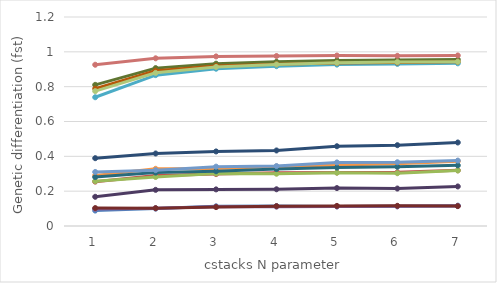
| Category | Series 0 | Series 1 | Series 2 | Series 3 | Series 4 | Series 5 | Series 6 | Series 7 | Series 8 | Series 9 | Series 10 | Series 11 | Series 12 | Series 13 | Series 14 |
|---|---|---|---|---|---|---|---|---|---|---|---|---|---|---|---|
| 0 | 0.089 | 0.255 | 0.258 | 0.098 | 0.739 | 0.29 | 0.389 | 0.103 | 0.81 | 0.168 | 0.281 | 0.789 | 0.31 | 0.926 | 0.774 |
| 1 | 0.1 | 0.29 | 0.281 | 0.101 | 0.866 | 0.328 | 0.416 | 0.102 | 0.907 | 0.208 | 0.306 | 0.892 | 0.32 | 0.963 | 0.879 |
| 2 | 0.113 | 0.298 | 0.301 | 0.11 | 0.903 | 0.33 | 0.428 | 0.109 | 0.932 | 0.21 | 0.314 | 0.919 | 0.341 | 0.974 | 0.913 |
| 3 | 0.114 | 0.306 | 0.3 | 0.111 | 0.918 | 0.341 | 0.434 | 0.114 | 0.943 | 0.211 | 0.327 | 0.929 | 0.344 | 0.976 | 0.928 |
| 4 | 0.113 | 0.307 | 0.306 | 0.113 | 0.927 | 0.35 | 0.458 | 0.115 | 0.951 | 0.218 | 0.336 | 0.936 | 0.365 | 0.979 | 0.937 |
| 5 | 0.113 | 0.308 | 0.303 | 0.113 | 0.931 | 0.358 | 0.464 | 0.116 | 0.953 | 0.215 | 0.34 | 0.939 | 0.366 | 0.977 | 0.941 |
| 6 | 0.117 | 0.32 | 0.319 | 0.115 | 0.934 | 0.372 | 0.479 | 0.114 | 0.956 | 0.227 | 0.348 | 0.943 | 0.376 | 0.979 | 0.943 |